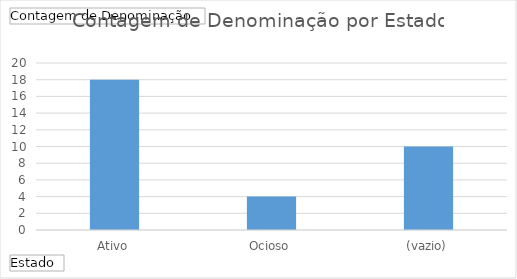
| Category | Total |
|---|---|
| Ativo | 18 |
| Ocioso | 4 |
| (vazio) | 10 |